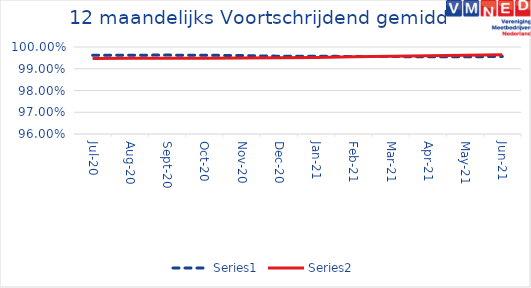
| Category | Series 0 | Series 1 |
|---|---|---|
| 2020-07-01 | 0.996 | 0.995 |
| 2020-08-01 | 0.996 | 0.995 |
| 2020-09-01 | 0.996 | 0.995 |
| 2020-10-01 | 0.996 | 0.995 |
| 2020-11-01 | 0.996 | 0.995 |
| 2020-12-01 | 0.996 | 0.995 |
| 2021-01-01 | 0.996 | 0.995 |
| 2021-02-01 | 0.996 | 0.995 |
| 2021-03-01 | 0.996 | 0.996 |
| 2021-04-01 | 0.996 | 0.996 |
| 2021-05-01 | 0.995 | 0.996 |
| 2021-06-01 | 0.996 | 0.996 |